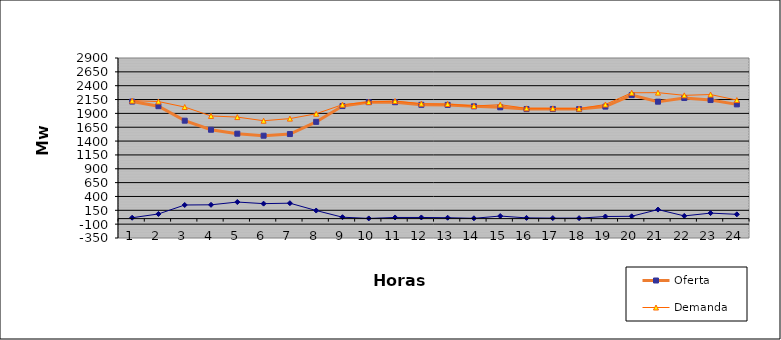
| Category | Oferta | Demanda | No Servida |
|---|---|---|---|
| 1.0 | 2113.58 | 2129.648 | 16.068 |
| 2.0 | 2029.77 | 2113.81 | 84.04 |
| 3.0 | 1768.4 | 2014.369 | 245.969 |
| 4.0 | 1604.47 | 1853.713 | 249.243 |
| 5.0 | 1533.62 | 1833.025 | 299.405 |
| 6.0 | 1496.96 | 1767.328 | 270.368 |
| 7.0 | 1526.71 | 1805.51 | 278.8 |
| 8.0 | 1747.2 | 1893.15 | 145.95 |
| 9.0 | 2032.03 | 2057.541 | 25.511 |
| 10.0 | 2102.39 | 2105.82 | 3.43 |
| 11.0 | 2101.86 | 2122.76 | 20.9 |
| 12.0 | 2054.83 | 2075.73 | 20.9 |
| 13.0 | 2053.27 | 2069.18 | 15.91 |
| 14.0 | 2027.66 | 2033.376 | 5.716 |
| 15.0 | 2010.16 | 2056.763 | 46.603 |
| 16.0 | 1977.55 | 1990.544 | 12.994 |
| 17.0 | 1979.95 | 1989.055 | 9.105 |
| 18.0 | 1977.6 | 1985.7 | 8.1 |
| 19.0 | 2022.39 | 2060.43 | 38.04 |
| 20.0 | 2230.05 | 2272.117 | 42.067 |
| 21.0 | 2111.3 | 2274.689 | 163.389 |
| 22.0 | 2177.25 | 2225.941 | 48.691 |
| 23.0 | 2140.83 | 2240.361 | 99.531 |
| 24.0 | 2062.59 | 2139.84 | 77.25 |